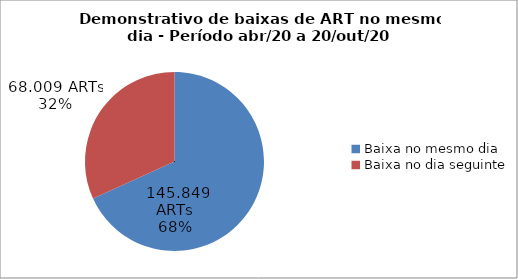
| Category | Series 0 |
|---|---|
| Baixa no mesmo dia | 145849 |
| Baixa no dia seguinte | 68009 |